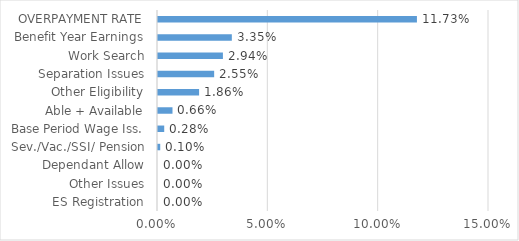
| Category | Series 0 |
|---|---|
| ES Registration | 0 |
| Other Issues | 0 |
| Dependant Allow | 0 |
| Sev./Vac./SSI/ Pension | 0.001 |
| Base Period Wage Iss. | 0.003 |
| Able + Available | 0.007 |
| Other Eligibility | 0.019 |
| Separation Issues | 0.025 |
| Work Search | 0.029 |
| Benefit Year Earnings | 0.033 |
| OVERPAYMENT RATE | 0.117 |